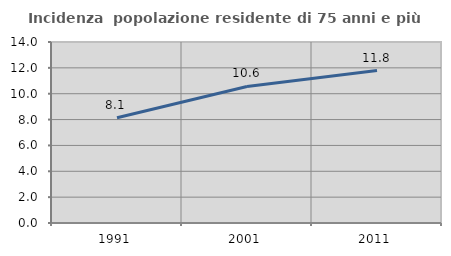
| Category | Incidenza  popolazione residente di 75 anni e più |
|---|---|
| 1991.0 | 8.146 |
| 2001.0 | 10.561 |
| 2011.0 | 11.791 |